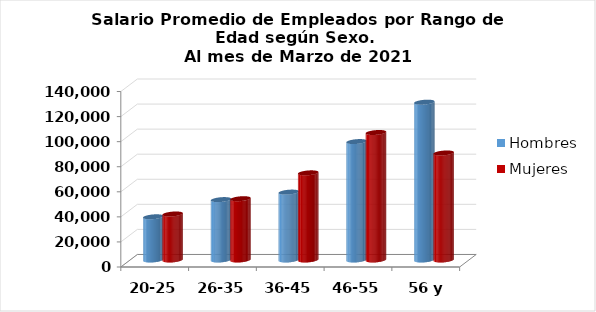
| Category | Hombres | Mujeres |
|---|---|---|
| 20-25 | 34467 | 36709 |
| 26-35 | 48188.931 | 48892.61 |
| 36-45 | 54166.759 | 69533.074 |
| 46-55 | 94488.618 | 101728.45 |
| 56 y más | 125924.722 | 85391.269 |